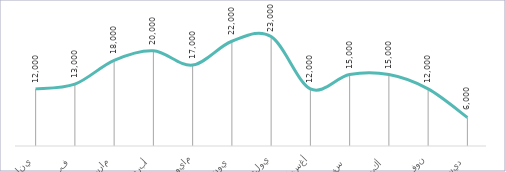
| Category | Series 0 |
|---|---|
| يناير | 12000 |
| فبراير | 13000 |
| مارس | 18000 |
| أبريل | 20000 |
| مايو | 17000 |
| يونيو | 22000 |
| يوليو | 23000 |
| أغسطس | 12000 |
| سبتمبر | 15000 |
| أكتوبر | 15000 |
| نوفمبر | 12000 |
| ديسمبر | 6000 |